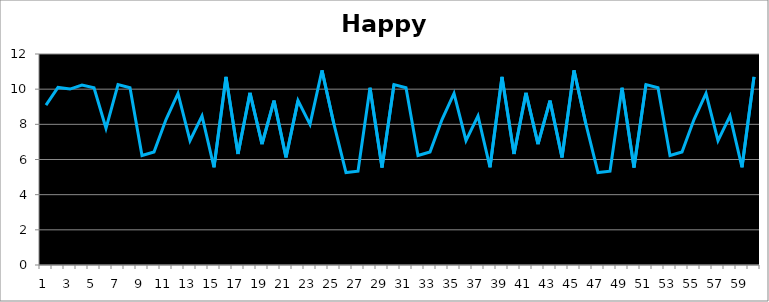
| Category | Happy |
|---|---|
| 0 | 9.095 |
| 1 | 10.101 |
| 2 | 10.005 |
| 3 | 10.238 |
| 4 | 10.08 |
| 5 | 7.775 |
| 6 | 10.263 |
| 7 | 10.078 |
| 8 | 6.229 |
| 9 | 6.431 |
| 10 | 8.272 |
| 11 | 9.757 |
| 12 | 7.067 |
| 13 | 8.476 |
| 14 | 5.556 |
| 15 | 10.699 |
| 16 | 6.309 |
| 17 | 9.79 |
| 18 | 6.878 |
| 19 | 9.349 |
| 20 | 6.118 |
| 21 | 9.351 |
| 22 | 8.001 |
| 23 | 11.071 |
| 24 | 7.992 |
| 25 | 5.26 |
| 26 | 5.334 |
| 27 | 10.08 |
| 28 | 5.55 |
| 29 | 10.263 |
| 30 | 10.078 |
| 31 | 6.229 |
| 32 | 6.431 |
| 33 | 8.272 |
| 34 | 9.757 |
| 35 | 7.067 |
| 36 | 8.476 |
| 37 | 5.556 |
| 38 | 10.699 |
| 39 | 6.309 |
| 40 | 9.79 |
| 41 | 6.878 |
| 42 | 9.349 |
| 43 | 6.118 |
| 44 | 11.071 |
| 45 | 7.992 |
| 46 | 5.26 |
| 47 | 5.334 |
| 48 | 10.08 |
| 49 | 5.55 |
| 50 | 10.263 |
| 51 | 10.078 |
| 52 | 6.229 |
| 53 | 6.431 |
| 54 | 8.272 |
| 55 | 9.757 |
| 56 | 7.067 |
| 57 | 8.476 |
| 58 | 5.556 |
| 59 | 10.699 |